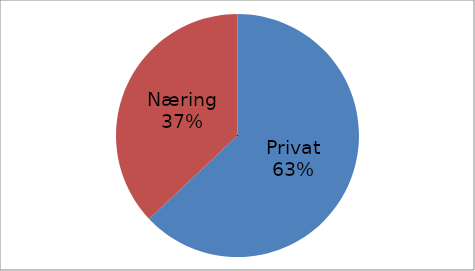
| Category | Series 0 |
|---|---|
| Privat | 43424007 |
| Næring | 25544192 |